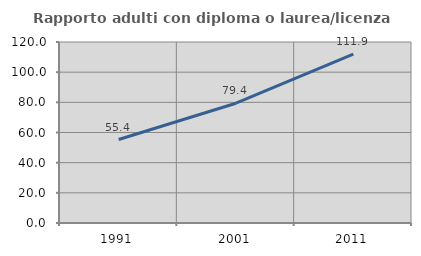
| Category | Rapporto adulti con diploma o laurea/licenza media  |
|---|---|
| 1991.0 | 55.357 |
| 2001.0 | 79.412 |
| 2011.0 | 111.94 |